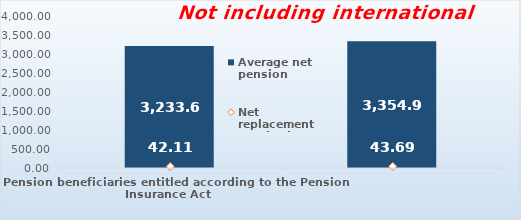
| Category | Average net pension  |
|---|---|
| Pension beneficiaries entitled according to the Pension Insurance Act   | 3233.61 |
| Pension beneficiaries entitled to pension FOR THE FIRST TIME in 2022 according to the Pension Insurance Act  - NEW BENEFICIARIES | 3354.901 |